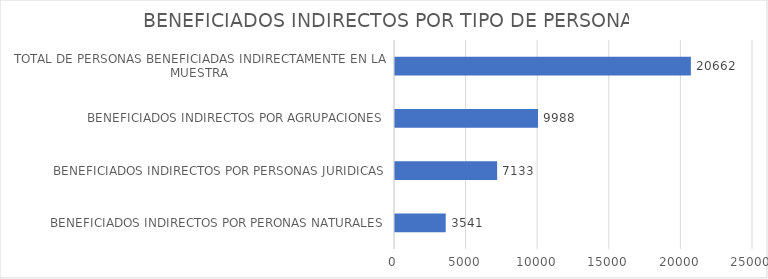
| Category | VALOR |
|---|---|
| BENEFICIADOS INDIRECTOS POR PERONAS NATURALES | 3541 |
| BENEFICIADOS INDIRECTOS POR PERSONAS JURIDICAS | 7133 |
| BENEFICIADOS INDIRECTOS POR AGRUPACIONES | 9988 |
| TOTAL DE PERSONAS BENEFICIADAS INDIRECTAMENTE EN LA MUESTRA | 20662 |